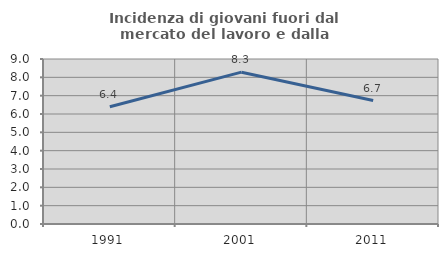
| Category | Incidenza di giovani fuori dal mercato del lavoro e dalla formazione  |
|---|---|
| 1991.0 | 6.395 |
| 2001.0 | 8.282 |
| 2011.0 | 6.735 |